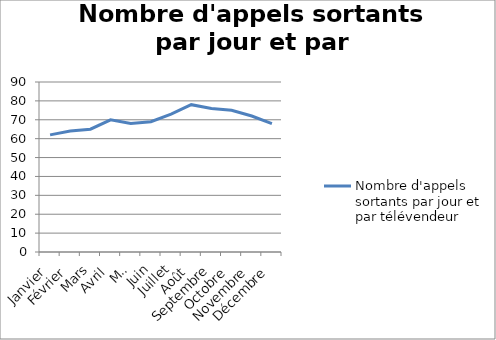
| Category | Nombre d'appels sortants par jour et par télévendeur |
|---|---|
| Janvier | 62 |
| Février | 64 |
| Mars | 65 |
| Avril | 70 |
| Mai | 68 |
| Juin | 69 |
| Juillet | 73 |
| Août | 78 |
| Septembre | 76 |
| Octobre | 75 |
| Novembre | 72 |
| Décembre | 68 |